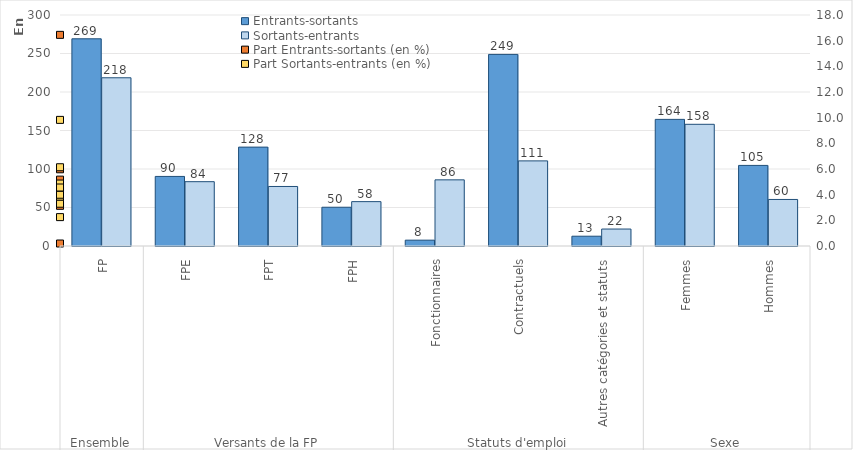
| Category | Entrants-sortants | Sortants-entrants |
|---|---|---|
| 0 | 269096 | 218472 |
| 1 | 90346 | 83541 |
| 2 | 128413 | 77304 |
| 3 | 50337 | 57627 |
| 4 | 7570 | 85915 |
| 5 | 248818 | 110533 |
| 6 | 12708 | 22024 |
| 7 | 164430 | 158041 |
| 8 | 104666 | 60431 |